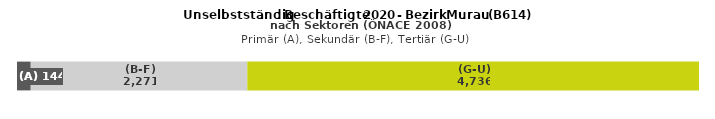
| Category | (A) | (B-F) | (G-U) |
|---|---|---|---|
| 0 | 144 | 2271 | 4736 |